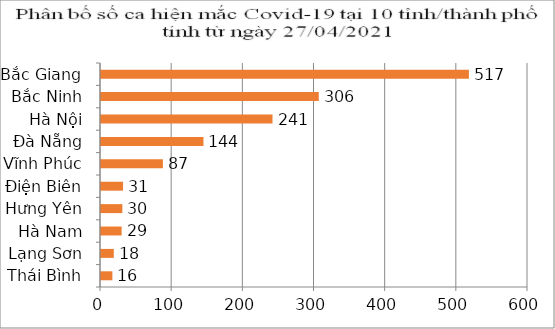
| Category | Series 0 |
|---|---|
| Thái Bình | 16 |
| Lạng Sơn | 18 |
| Hà Nam | 29 |
| Hưng Yên | 30 |
| Điện Biên | 31 |
| Vĩnh Phúc | 87 |
| Đà Nẵng | 144 |
| Hà Nội | 241 |
| Bắc Ninh | 306 |
| Bắc Giang | 517 |